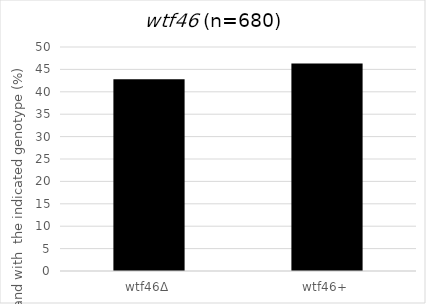
| Category | spores that are viable and with the indicated genotype |
|---|---|
| wtf46Δ | 42.794 |
| wtf46+ | 46.324 |